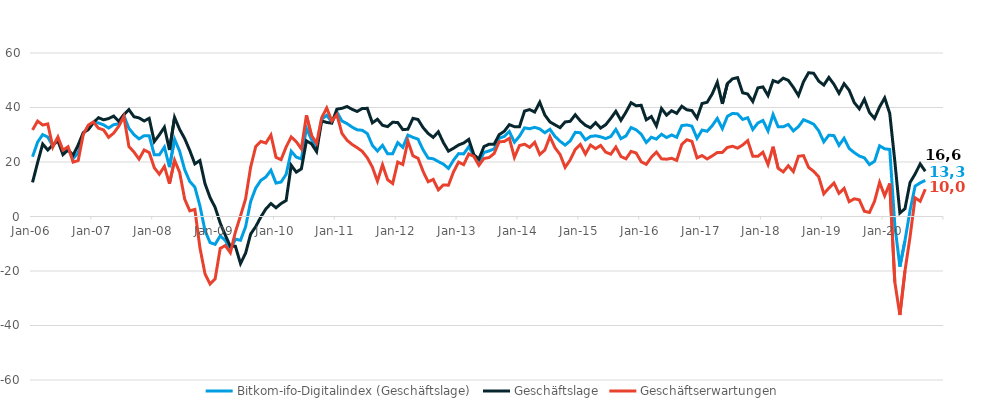
| Category | Bitkom-ifo-Digitalindex (Geschäftslage) | Geschäftslage | Geschäftserwartungen |
|---|---|---|---|
| 2006-01-01 | 21.934 | 12.522 | 31.764 |
| 2006-02-01 | 27.273 | 19.788 | 35.013 |
| 2006-03-01 | 30.055 | 26.601 | 33.561 |
| 2006-04-01 | 29.147 | 24.416 | 33.978 |
| 2006-05-01 | 25.883 | 26.255 | 25.512 |
| 2006-06-01 | 28.486 | 27.781 | 29.192 |
| 2006-07-01 | 23.524 | 22.704 | 24.348 |
| 2006-08-01 | 24.986 | 24.393 | 25.581 |
| 2006-09-01 | 21.25 | 22.549 | 19.96 |
| 2006-10-01 | 23.376 | 26.265 | 20.524 |
| 2006-11-01 | 30.442 | 30.768 | 30.117 |
| 2006-12-01 | 32.726 | 31.897 | 33.557 |
| 2007-01-01 | 34.551 | 34.422 | 34.68 |
| 2007-02-01 | 34.325 | 36.269 | 32.397 |
| 2007-03-01 | 33.63 | 35.481 | 31.794 |
| 2007-04-01 | 32.473 | 35.942 | 29.054 |
| 2007-05-01 | 33.708 | 36.86 | 30.599 |
| 2007-06-01 | 34.016 | 34.904 | 33.131 |
| 2007-07-01 | 37.065 | 37.412 | 36.719 |
| 2007-08-01 | 32.357 | 39.235 | 25.678 |
| 2007-09-01 | 30.038 | 36.607 | 23.651 |
| 2007-10-01 | 28.492 | 36.178 | 21.056 |
| 2007-11-01 | 29.665 | 35.059 | 24.394 |
| 2007-12-01 | 29.649 | 36.012 | 23.458 |
| 2008-01-01 | 22.648 | 27.505 | 17.895 |
| 2008-02-01 | 22.625 | 29.965 | 15.519 |
| 2008-03-01 | 25.466 | 32.762 | 18.399 |
| 2008-04-01 | 18.118 | 24.398 | 12.014 |
| 2008-05-01 | 28.377 | 36.362 | 20.661 |
| 2008-06-01 | 23.955 | 31.966 | 16.221 |
| 2008-07-01 | 17.183 | 28.577 | 6.357 |
| 2008-08-01 | 12.865 | 24.218 | 2.088 |
| 2008-09-01 | 10.788 | 19.315 | 2.593 |
| 2008-10-01 | 3.907 | 20.534 | -11.466 |
| 2008-11-01 | -5.175 | 12.053 | -21.004 |
| 2008-12-01 | -9.573 | 6.966 | -24.791 |
| 2009-01-01 | -10.217 | 3.335 | -22.866 |
| 2009-02-01 | -7.116 | -2.399 | -11.72 |
| 2009-03-01 | -8.763 | -6.85 | -10.656 |
| 2009-04-01 | -12.123 | -10.969 | -13.271 |
| 2009-05-01 | -8.317 | -10.944 | -5.654 |
| 2009-06-01 | -8.727 | -17.268 | 0.214 |
| 2009-07-01 | -3.788 | -13.508 | 6.438 |
| 2009-08-01 | 5.47 | -6.431 | 18.104 |
| 2009-09-01 | 10.442 | -3.725 | 25.631 |
| 2009-10-01 | 13.222 | -0.218 | 27.567 |
| 2009-11-01 | 14.511 | 2.765 | 26.938 |
| 2009-12-01 | 16.96 | 4.749 | 29.898 |
| 2010-01-01 | 12.254 | 3.211 | 21.698 |
| 2010-02-01 | 12.653 | 4.753 | 20.858 |
| 2010-03-01 | 15.475 | 5.865 | 25.533 |
| 2010-04-01 | 23.934 | 18.781 | 29.207 |
| 2010-05-01 | 21.798 | 16.279 | 27.457 |
| 2010-06-01 | 21.108 | 17.469 | 24.808 |
| 2010-07-01 | 32.41 | 27.759 | 37.156 |
| 2010-08-01 | 28.219 | 26.671 | 29.777 |
| 2010-09-01 | 25.32 | 23.803 | 26.848 |
| 2010-10-01 | 35.657 | 35.086 | 36.229 |
| 2010-11-01 | 37.158 | 34.522 | 39.824 |
| 2010-12-01 | 34.662 | 34.258 | 35.066 |
| 2011-01-01 | 38.37 | 39.394 | 37.351 |
| 2011-02-01 | 35.045 | 39.696 | 30.485 |
| 2011-03-01 | 34.1 | 40.367 | 27.996 |
| 2011-04-01 | 32.799 | 39.335 | 26.441 |
| 2011-05-01 | 31.803 | 38.538 | 25.258 |
| 2011-06-01 | 31.645 | 39.639 | 23.918 |
| 2011-07-01 | 30.436 | 39.692 | 21.537 |
| 2011-08-01 | 26.101 | 34.37 | 18.125 |
| 2011-09-01 | 24.033 | 35.677 | 12.965 |
| 2011-10-01 | 26.112 | 33.471 | 18.985 |
| 2011-11-01 | 23.034 | 32.986 | 13.508 |
| 2011-12-01 | 23.064 | 34.593 | 12.101 |
| 2012-01-01 | 27.116 | 34.478 | 19.984 |
| 2012-02-01 | 25.386 | 31.882 | 19.072 |
| 2012-03-01 | 29.862 | 32.033 | 27.711 |
| 2012-04-01 | 29.041 | 36.02 | 22.269 |
| 2012-05-01 | 28.378 | 35.599 | 21.378 |
| 2012-06-01 | 24.439 | 32.618 | 16.547 |
| 2012-07-01 | 21.436 | 30.469 | 12.757 |
| 2012-08-01 | 21.186 | 29.041 | 13.6 |
| 2012-09-01 | 20.17 | 31.075 | 9.78 |
| 2012-10-01 | 19.216 | 27.133 | 11.575 |
| 2012-11-01 | 17.646 | 23.986 | 11.485 |
| 2012-12-01 | 20.671 | 25.047 | 16.381 |
| 2013-01-01 | 23.082 | 26.243 | 19.965 |
| 2013-02-01 | 22.962 | 26.96 | 19.034 |
| 2013-03-01 | 25.603 | 28.29 | 22.947 |
| 2013-04-01 | 22.382 | 22.703 | 22.062 |
| 2013-05-01 | 19.933 | 21.079 | 18.792 |
| 2013-06-01 | 23.459 | 25.654 | 21.285 |
| 2013-07-01 | 24.063 | 26.526 | 21.627 |
| 2013-08-01 | 24.802 | 26.514 | 23.103 |
| 2013-09-01 | 28.735 | 30.041 | 27.437 |
| 2013-10-01 | 29.384 | 31.268 | 27.516 |
| 2013-11-01 | 31.186 | 33.705 | 28.695 |
| 2013-12-01 | 27.261 | 32.971 | 21.691 |
| 2014-01-01 | 29.464 | 32.956 | 26.024 |
| 2014-02-01 | 32.532 | 38.686 | 26.537 |
| 2014-03-01 | 32.213 | 39.242 | 25.39 |
| 2014-04-01 | 32.72 | 38.332 | 27.241 |
| 2014-05-01 | 32.144 | 41.933 | 22.751 |
| 2014-06-01 | 30.727 | 37.252 | 24.381 |
| 2014-07-01 | 32.011 | 34.716 | 29.337 |
| 2014-08-01 | 29.397 | 33.642 | 25.23 |
| 2014-09-01 | 27.633 | 32.593 | 22.779 |
| 2014-10-01 | 26.202 | 34.694 | 18.017 |
| 2014-11-01 | 27.741 | 34.929 | 20.772 |
| 2014-12-01 | 30.887 | 37.336 | 24.614 |
| 2015-01-01 | 30.738 | 35.101 | 26.456 |
| 2015-02-01 | 28.129 | 33.468 | 22.911 |
| 2015-03-01 | 29.362 | 32.554 | 26.214 |
| 2015-04-01 | 29.626 | 34.447 | 24.905 |
| 2015-05-01 | 29.241 | 32.453 | 26.073 |
| 2015-06-01 | 28.596 | 33.683 | 23.619 |
| 2015-07-01 | 29.351 | 36.019 | 22.872 |
| 2015-08-01 | 31.964 | 38.619 | 25.494 |
| 2015-09-01 | 28.56 | 35.292 | 22.02 |
| 2015-10-01 | 29.575 | 38.308 | 21.162 |
| 2015-11-01 | 32.65 | 41.748 | 23.894 |
| 2015-12-01 | 31.813 | 40.639 | 23.31 |
| 2016-01-01 | 30.206 | 40.817 | 20.064 |
| 2016-02-01 | 27.171 | 35.491 | 19.145 |
| 2016-03-01 | 29.081 | 36.671 | 21.734 |
| 2016-04-01 | 28.396 | 33.239 | 23.654 |
| 2016-05-01 | 30.206 | 39.623 | 21.159 |
| 2016-06-01 | 28.969 | 37.199 | 21.025 |
| 2016-07-01 | 29.928 | 38.825 | 21.363 |
| 2016-08-01 | 29.052 | 37.842 | 20.587 |
| 2016-09-01 | 33.351 | 40.445 | 26.466 |
| 2016-10-01 | 33.598 | 39.159 | 28.166 |
| 2016-11-01 | 33.158 | 38.867 | 27.585 |
| 2016-12-01 | 28.698 | 36.107 | 21.521 |
| 2017-01-01 | 31.719 | 41.469 | 22.363 |
| 2017-02-01 | 31.284 | 41.925 | 21.112 |
| 2017-03-01 | 33.329 | 44.98 | 22.232 |
| 2017-04-01 | 36.016 | 49.27 | 23.467 |
| 2017-05-01 | 32.234 | 41.325 | 23.485 |
| 2017-06-01 | 36.77 | 48.777 | 25.341 |
| 2017-07-01 | 37.833 | 50.518 | 25.79 |
| 2017-08-01 | 37.667 | 50.961 | 25.077 |
| 2017-09-01 | 35.625 | 45.401 | 26.238 |
| 2017-10-01 | 36.245 | 44.945 | 27.854 |
| 2017-11-01 | 31.927 | 42.212 | 22.078 |
| 2017-12-01 | 34.305 | 47.209 | 22.074 |
| 2018-01-01 | 35.264 | 47.553 | 23.584 |
| 2018-02-01 | 31.397 | 44.404 | 19.082 |
| 2018-03-01 | 37.435 | 49.872 | 25.617 |
| 2018-04-01 | 32.907 | 49.192 | 17.687 |
| 2018-05-01 | 32.928 | 50.764 | 16.36 |
| 2018-06-01 | 33.776 | 49.963 | 18.637 |
| 2018-07-01 | 31.408 | 47.386 | 16.462 |
| 2018-08-01 | 32.978 | 44.384 | 22.104 |
| 2018-09-01 | 35.51 | 49.46 | 22.34 |
| 2018-10-01 | 34.755 | 52.761 | 18.032 |
| 2018-11-01 | 33.88 | 52.563 | 16.579 |
| 2018-12-01 | 31.449 | 49.685 | 14.544 |
| 2019-01-01 | 27.407 | 48.239 | 8.324 |
| 2019-02-01 | 29.841 | 51.03 | 10.441 |
| 2019-03-01 | 29.68 | 48.51 | 12.276 |
| 2019-04-01 | 26.106 | 45.211 | 8.49 |
| 2019-05-01 | 28.734 | 48.728 | 10.348 |
| 2019-06-01 | 24.957 | 46.334 | 5.435 |
| 2019-07-01 | 23.458 | 41.808 | 6.5 |
| 2019-08-01 | 22.189 | 39.522 | 6.111 |
| 2019-09-01 | 21.526 | 43.04 | 1.917 |
| 2019-10-01 | 19.054 | 38.167 | 1.475 |
| 2019-11-01 | 20.259 | 35.988 | 5.579 |
| 2019-12-01 | 25.945 | 40.214 | 12.523 |
| 2020-01-01 | 24.838 | 43.509 | 7.598 |
| 2020-02-01 | 24.619 | 37.863 | 12.113 |
| 2020-03-01 | -3.137 | 20.278 | -24.062 |
| 2020-04-01 | -18.403 | 1.274 | -36.156 |
| 2020-05-01 | -8.901 | 2.863 | -19.983 |
| 2020-06-01 | 2.225 | 12.472 | -7.528 |
| 2020-07-01 | 11.167 | 15.588 | 6.837 |
| 2020-08-01 | 12.327 | 19.293 | 5.582 |
| 2020-09-01 | 13.279 | 16.613 | 9.996 |